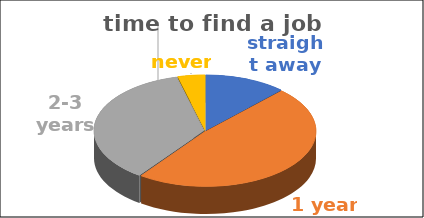
| Category | time to find a job | Series 1 | Series 2 | Series 3 | Series 4 |
|---|---|---|---|---|---|
| straight away | 0.12 |  |  |  |  |
| 1 year | 0.48 |  |  |  |  |
| 2-3 years | 0.36 |  |  |  |  |
| never | 0.04 |  |  |  |  |